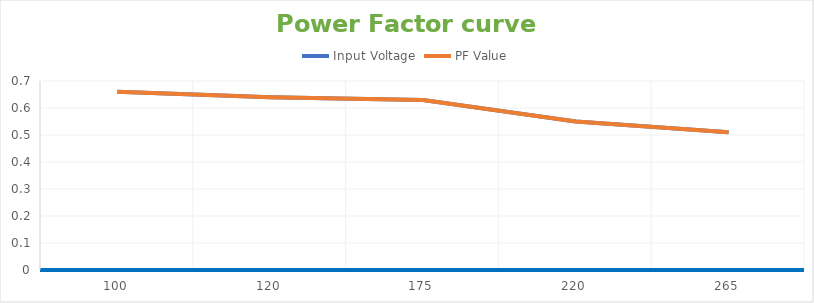
| Category | Input Voltage | PF Value |
|---|---|---|
| 100.0 | 0.66 | 0.66 |
| 120.0 | 0.64 | 0.64 |
| 175.0 | 0.63 | 0.63 |
| 220.0 | 0.55 | 0.55 |
| 265.0 | 0.51 | 0.51 |